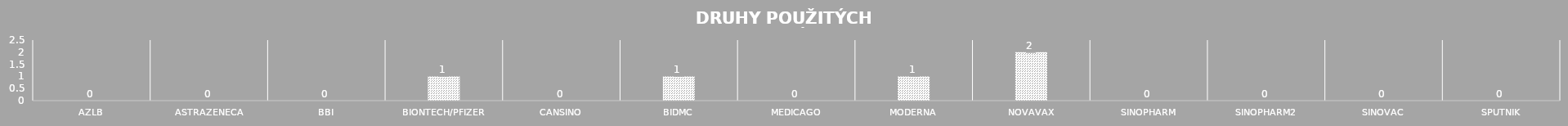
| Category | počet |
|---|---|
| AZLB | 0 |
| AstraZeneca | 0 |
| BBI | 0 |
| BioNTech/Pfizer | 1 |
| CanSino | 0 |
| BIDMC | 1 |
| Medicago | 0 |
| Moderna | 1 |
| Novavax | 2 |
| Sinopharm | 0 |
| Sinopharm2 | 0 |
| Sinovac | 0 |
| Sputnik | 0 |